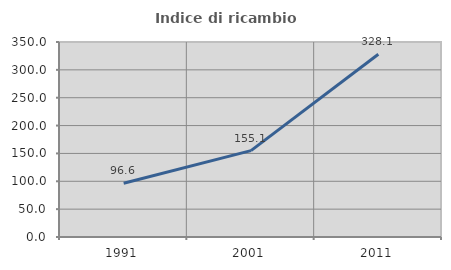
| Category | Indice di ricambio occupazionale  |
|---|---|
| 1991.0 | 96.585 |
| 2001.0 | 155.072 |
| 2011.0 | 328.125 |